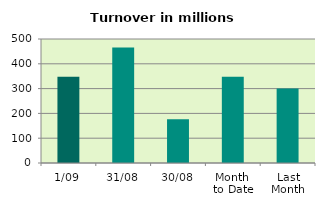
| Category | Series 0 |
|---|---|
| 1/09 | 348.253 |
| 31/08 | 465.706 |
| 30/08 | 176.668 |
| Month 
to Date | 348.253 |
| Last
Month | 300.77 |